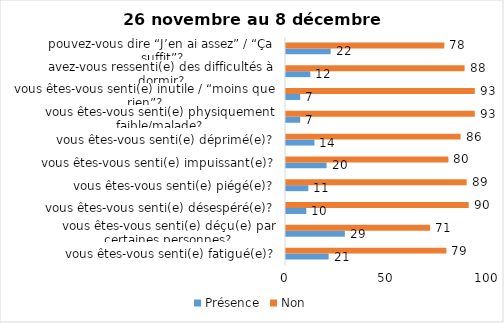
| Category | Présence | Non |
|---|---|---|
| vous êtes-vous senti(e) fatigué(e)? | 21 | 79 |
| vous êtes-vous senti(e) déçu(e) par certaines personnes? | 29 | 71 |
| vous êtes-vous senti(e) désespéré(e)? | 10 | 90 |
| vous êtes-vous senti(e) piégé(e)? | 11 | 89 |
| vous êtes-vous senti(e) impuissant(e)? | 20 | 80 |
| vous êtes-vous senti(e) déprimé(e)? | 14 | 86 |
| vous êtes-vous senti(e) physiquement faible/malade? | 7 | 93 |
| vous êtes-vous senti(e) inutile / “moins que rien”? | 7 | 93 |
| avez-vous ressenti(e) des difficultés à dormir? | 12 | 88 |
| pouvez-vous dire “J’en ai assez” / “Ça suffit”? | 22 | 78 |